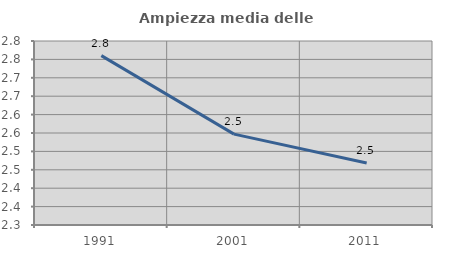
| Category | Ampiezza media delle famiglie |
|---|---|
| 1991.0 | 2.76 |
| 2001.0 | 2.547 |
| 2011.0 | 2.468 |